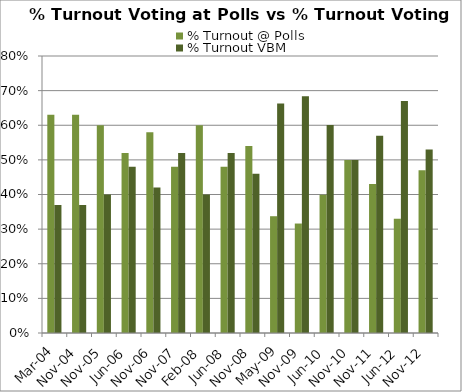
| Category | % Turnout @ Polls | % Turnout VBM |
|---|---|---|
| Mar-04 | 0.63 | 0.37 |
| Nov-04 | 0.63 | 0.37 |
| Nov-05 | 0.6 | 0.4 |
| Jun-06 | 0.52 | 0.48 |
| Nov-06 | 0.58 | 0.42 |
| Nov-07 | 0.48 | 0.52 |
| Feb-08 | 0.6 | 0.4 |
| Jun-08 | 0.48 | 0.52 |
| Nov-08 | 0.54 | 0.46 |
| May-09 | 0.337 | 0.663 |
| Nov-09 | 0.316 | 0.684 |
| Jun-10 | 0.399 | 0.601 |
| Nov-10 | 0.5 | 0.5 |
| Nov-11 | 0.43 | 0.57 |
| Jun-12 | 0.33 | 0.67 |
| Nov-12 | 0.47 | 0.53 |